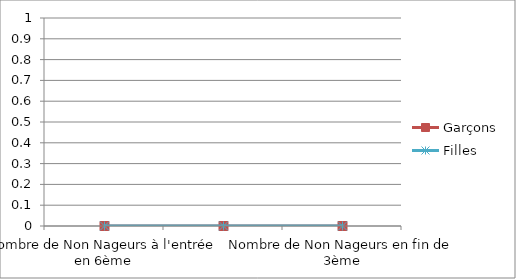
| Category | Garçons | Filles |
|---|---|---|
| Nombre de Non Nageurs à l'entrée en 6ème | 0 | 0 |
| Nombre de Non Nageurs en fin de 6ème | 0 | 0 |
| Nombre de Non Nageurs en fin de 3ème | 0 | 0 |